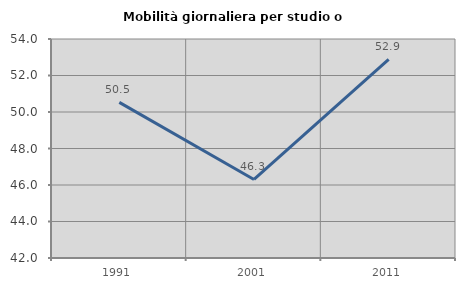
| Category | Mobilità giornaliera per studio o lavoro |
|---|---|
| 1991.0 | 50.525 |
| 2001.0 | 46.305 |
| 2011.0 | 52.879 |